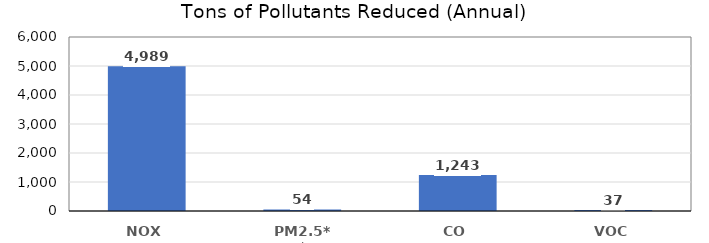
| Category | Series 0 |
|---|---|
| NOX | 4989.466 |
| PM2.5** | 54.225 |
| CO | 1242.89 |
| VOC | 37.476 |